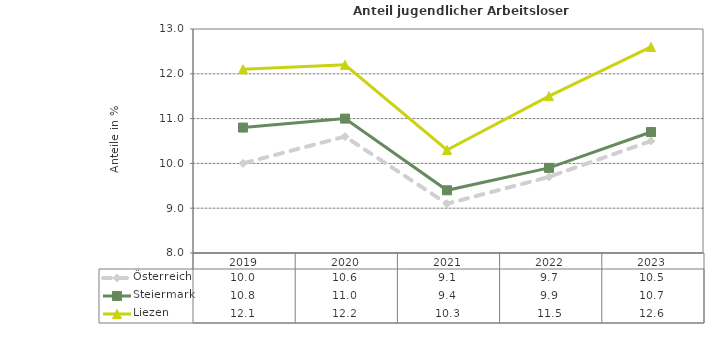
| Category | Österreich | Steiermark | Liezen |
|---|---|---|---|
| 2023.0 | 10.5 | 10.7 | 12.6 |
| 2022.0 | 9.7 | 9.9 | 11.5 |
| 2021.0 | 9.1 | 9.4 | 10.3 |
| 2020.0 | 10.6 | 11 | 12.2 |
| 2019.0 | 10 | 10.8 | 12.1 |